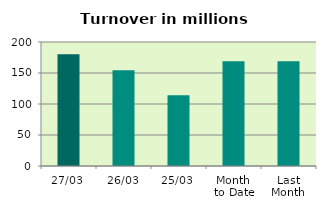
| Category | Series 0 |
|---|---|
| 27/03 | 180.295 |
| 26/03 | 154.281 |
| 25/03 | 113.942 |
| Month 
to Date | 168.893 |
| Last
Month | 168.971 |